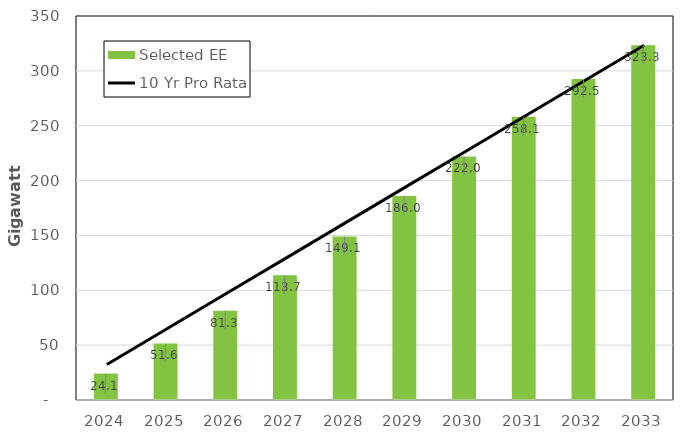
| Category | Selected EE |
|---|---|
| 0 | 24.067 |
| 1 | 51.6 |
| 2 | 81.306 |
| 3 | 113.743 |
| 4 | 149.052 |
| 5 | 186.046 |
| 6 | 222.01 |
| 7 | 258.093 |
| 8 | 292.482 |
| 9 | 323.334 |